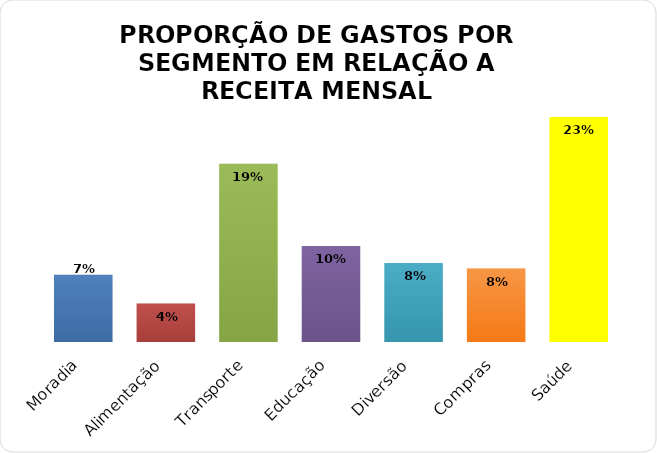
| Category | Series 0 |
|---|---|
| Moradia | 0.07 |
| Alimentação | 0.04 |
| Transporte | 0.186 |
| Educação | 0.1 |
| Diversão | 0.082 |
| Compras | 0.076 |
| Saúde | 0.234 |